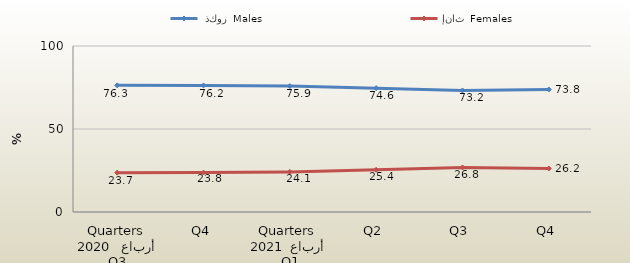
| Category |  ذكور  Males | إناث  Females |
|---|---|---|
| 0 | 76.286 | 23.714 |
| 1 | 76.241 | 23.759 |
| 2 | 75.852 | 24.148 |
| 3 | 74.599 | 25.401 |
| 4 | 73.206 | 26.833 |
| 5 | 73.8 | 26.2 |